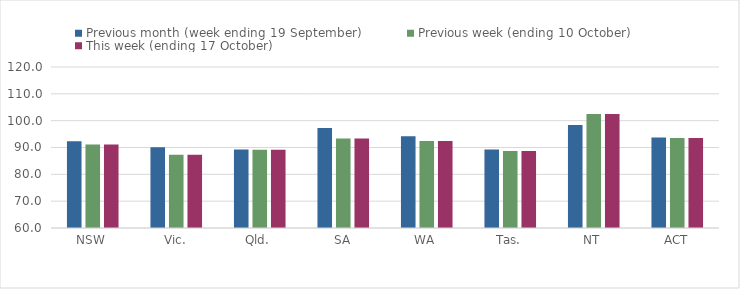
| Category | Previous month (week ending 19 September) | Previous week (ending 10 October) | This week (ending 17 October) |
|---|---|---|---|
| NSW | 92.3 | 91.14 | 91.14 |
| Vic. | 90.11 | 87.27 | 87.27 |
| Qld. | 89.27 | 89.19 | 89.19 |
| SA | 97.28 | 93.32 | 93.32 |
| WA | 94.19 | 92.46 | 92.46 |
| Tas. | 89.27 | 88.74 | 88.74 |
| NT | 98.35 | 102.47 | 102.47 |
| ACT | 93.7 | 93.54 | 93.54 |